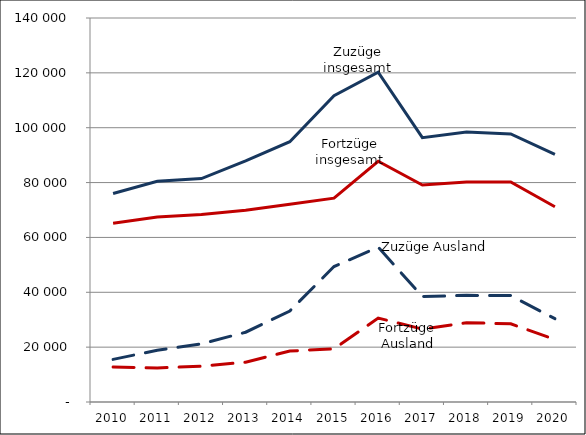
| Category | Zuzüge insgesamt | Zuzüge Ausland | Fortzüge insgesamt | Fortzüge Ausland |
|---|---|---|---|---|
| 2010.0 | 76032 | 15542 | 65209 | 12763 |
| 2011.0 | 80446 | 18887 | 67433 | 12401 |
| 2012.0 | 81472 | 21188 | 68334 | 13076 |
| 2013.0 | 87939 | 25439 | 69872 | 14506 |
| 2014.0 | 94900 | 33167 | 72104 | 18593 |
| 2015.0 | 111661 | 49379 | 74317 | 19376 |
| 2016.0 | 120235 | 56476 | 87754 | 30599 |
| 2017.0 | 96375 | 38438 | 79097 | 26566 |
| 2018.0 | 98424 | 38891 | 80217 | 28929 |
| 2019.0 | 97716 | 38791 | 80195 | 28497 |
| 2020.0 | 90243 | 30375 | 71178 | 22794 |